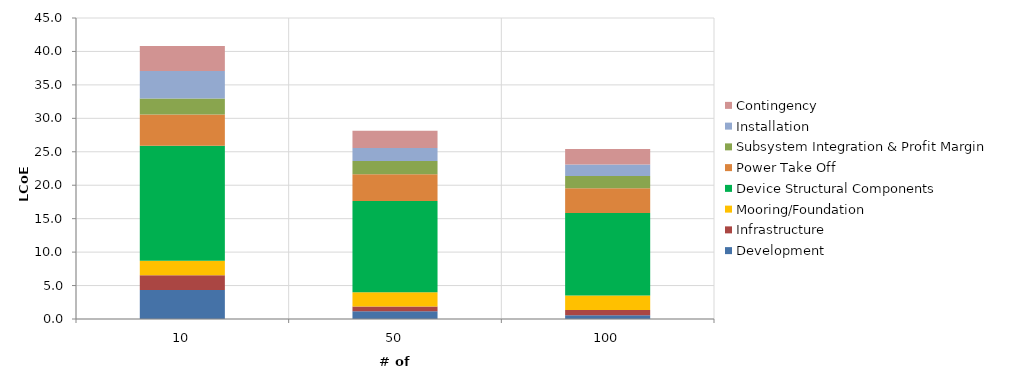
| Category | Development | Infrastructure | Mooring/Foundation | Device Structural Components | Power Take Off | Subsystem Integration & Profit Margin | Installation | Contingency |
|---|---|---|---|---|---|---|---|---|
| 10.0 | 4.335 | 2.211 | 2.149 | 17.196 | 4.664 | 2.401 | 4.132 | 3.709 |
| 50.0 | 1.167 | 0.688 | 2.149 | 13.639 | 3.99 | 1.978 | 1.959 | 2.557 |
| 100.0 | 0.561 | 0.788 | 2.149 | 12.343 | 3.708 | 1.82 | 1.723 | 2.309 |